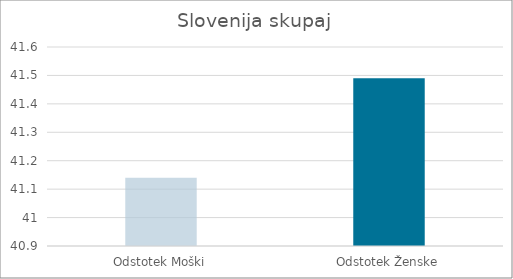
| Category | Series 0 |
|---|---|
| Odstotek Moški | 41.14 |
| Odstotek Ženske | 41.49 |